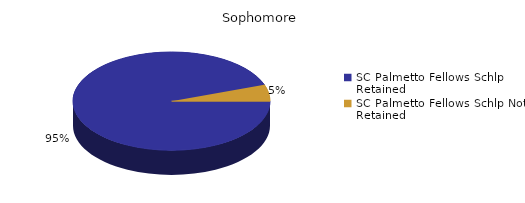
| Category | Sophomore |
|---|---|
| SC Palmetto Fellows Schlp Retained  | 590 |
| SC Palmetto Fellows Schlp Not Retained  | 34 |